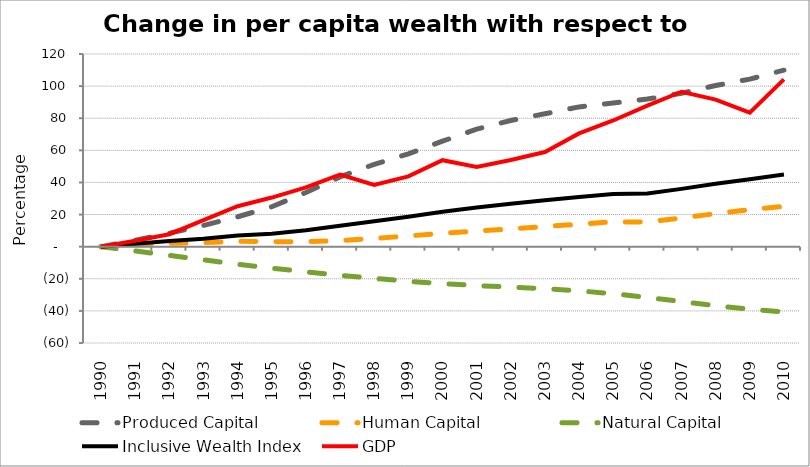
| Category | Produced Capital  | Human Capital | Natural Capital | Inclusive Wealth Index | GDP |
|---|---|---|---|---|---|
| 1990.0 | 0 | 0 | 0 | 0 | 0 |
| 1991.0 | 3.978 | 1.168 | -2.673 | 1.822 | 3.639 |
| 1992.0 | 8.386 | 2.09 | -5.455 | 3.555 | 7.755 |
| 1993.0 | 13.236 | 2.45 | -8.237 | 4.959 | 16.59 |
| 1994.0 | 18.606 | 3.372 | -10.895 | 6.916 | 25.185 |
| 1995.0 | 24.882 | 3.012 | -13.357 | 8.099 | 30.586 |
| 1996.0 | 33.773 | 3.085 | -15.655 | 10.224 | 36.962 |
| 1997.0 | 43.48 | 3.856 | -17.819 | 13.075 | 44.864 |
| 1998.0 | 51.294 | 5.099 | -19.798 | 15.846 | 38.396 |
| 1999.0 | 57.799 | 6.676 | -21.538 | 18.57 | 43.806 |
| 2000.0 | 65.707 | 8.339 | -23.032 | 21.686 | 53.868 |
| 2001.0 | 73.164 | 9.684 | -24.224 | 24.453 | 49.637 |
| 2002.0 | 78.61 | 11.066 | -25.187 | 26.78 | 53.998 |
| 2003.0 | 82.797 | 12.495 | -26.173 | 28.851 | 58.957 |
| 2004.0 | 87.054 | 13.991 | -27.488 | 30.99 | 70.546 |
| 2005.0 | 89.499 | 15.517 | -29.287 | 32.729 | 78.593 |
| 2006.0 | 91.926 | 15.267 | -31.595 | 33.101 | 87.799 |
| 2007.0 | 95.566 | 17.939 | -34.205 | 35.999 | 96.484 |
| 2008.0 | 100.381 | 20.552 | -36.788 | 39.123 | 91.578 |
| 2009.0 | 104.364 | 23.051 | -39.004 | 41.967 | 83.437 |
| 2010.0 | 109.91 | 25.219 | -40.693 | 44.921 | 104.171 |